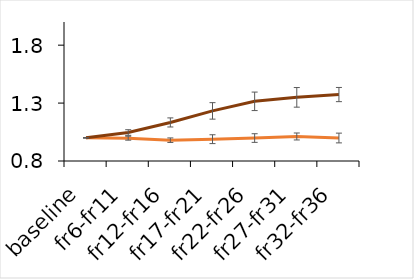
| Category | Series 0 | Series 1 |
|---|---|---|
| baseline | 1 | 1 |
| fr6-fr11 | 0.997 | 1.046 |
| fr12-fr16 | 0.98 | 1.133 |
| fr17-fr21 | 0.988 | 1.233 |
| fr22-fr26 | 0.998 | 1.315 |
| fr27-fr31 | 1.012 | 1.349 |
| fr32-fr36 | 0.998 | 1.374 |